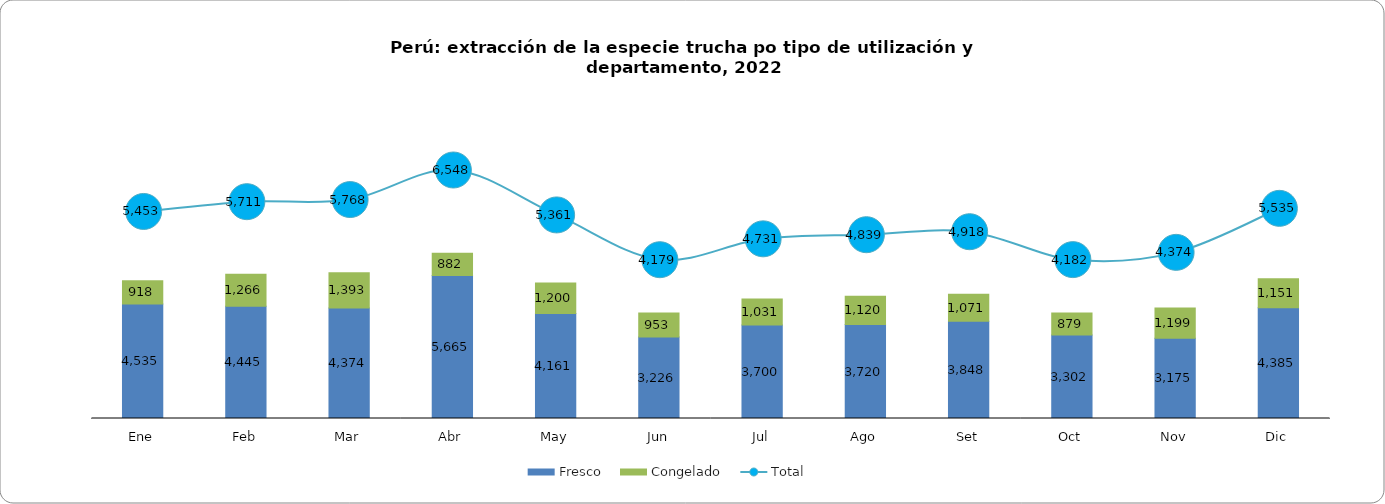
| Category | Fresco | Congelado |
|---|---|---|
| Ene | 4534.911 | 918.158 |
| Feb | 4445.228 | 1266.229 |
| Mar | 4374.195 | 1393.367 |
| Abr | 5665.227 | 882.449 |
| May | 4161.115 | 1200.363 |
| Jun | 3226.268 | 953.065 |
| Jul | 3699.663 | 1030.847 |
| Ago | 3719.624 | 1119.685 |
| Set | 3847.777 | 1070.686 |
| Oct | 3302.44 | 879.303 |
| Nov | 3175.045 | 1198.539 |
| Dic | 4384.552 | 1150.82 |